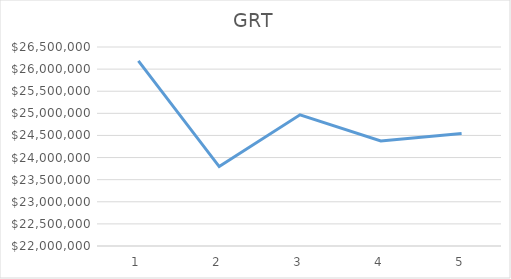
| Category | Series 0 |
|---|---|
| 0 | 26186273.91 |
| 1 | 23795131.78 |
| 2 | 24966921.6 |
| 3 | 24376470.9 |
| 4 | 24543080.04 |